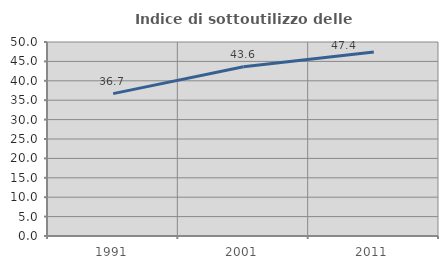
| Category | Indice di sottoutilizzo delle abitazioni  |
|---|---|
| 1991.0 | 36.689 |
| 2001.0 | 43.624 |
| 2011.0 | 47.403 |